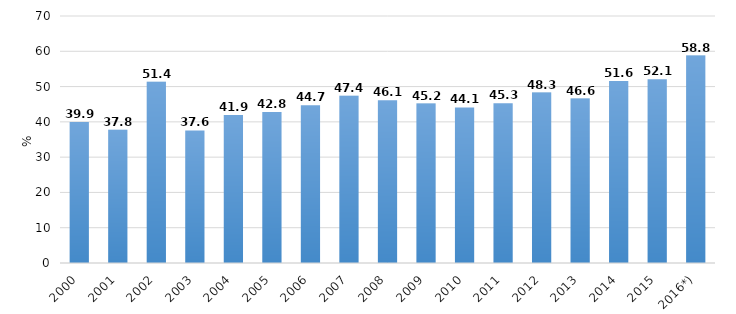
| Category | Series 0 |
|---|---|
| 2000 | 39.926 |
| 2001 | 37.758 |
| 2002 | 51.396 |
| 2003 | 37.569 |
| 2004 | 41.926 |
| 2005 | 42.8 |
| 2006 | 44.7 |
| 2007 | 47.4 |
| 2008 | 46.1 |
| 2009 | 45.2 |
| 2010 | 44.1 |
| 2011 | 45.3 |
| 2012 | 48.3 |
| 2013 | 46.6 |
| 2014 | 51.6 |
| 2015 | 52.1 |
| 2016*) | 58.8 |